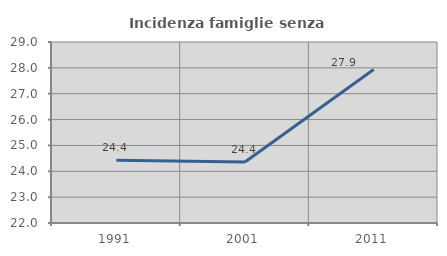
| Category | Incidenza famiglie senza nuclei |
|---|---|
| 1991.0 | 24.43 |
| 2001.0 | 24.359 |
| 2011.0 | 27.939 |